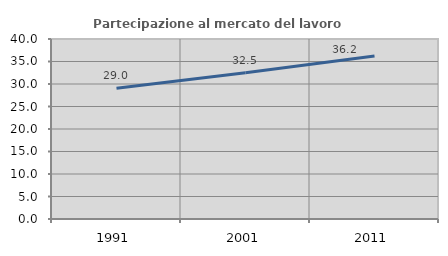
| Category | Partecipazione al mercato del lavoro  femminile |
|---|---|
| 1991.0 | 29.032 |
| 2001.0 | 32.5 |
| 2011.0 | 36.207 |